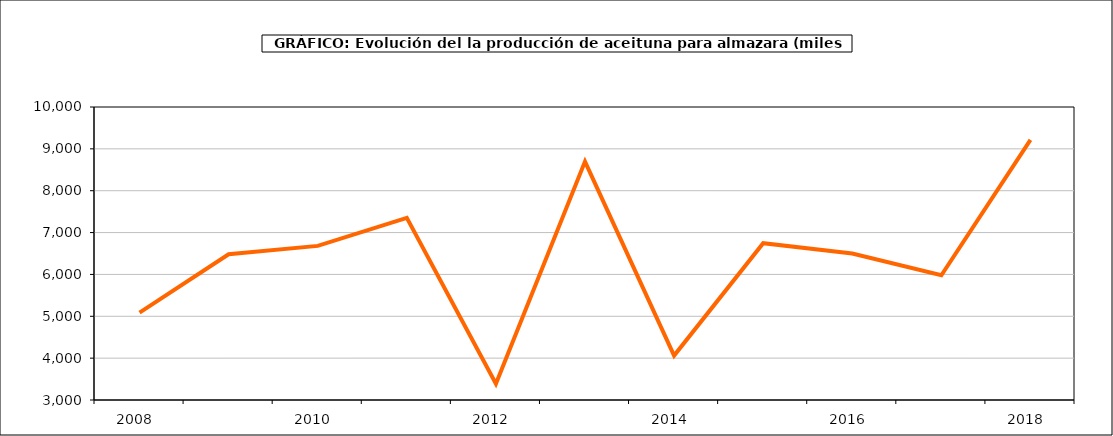
| Category | producción |
|---|---|
| 2008.0 | 5088.942 |
| 2009.0 | 6482.726 |
| 2010.0 | 6682.009 |
| 2011.0 | 7352.697 |
| 2012.0 | 3387.3 |
| 2013.0 | 8695.861 |
| 2014.0 | 4060.978 |
| 2015.0 | 6745.306 |
| 2016.0 | 6499.902 |
| 2017.0 | 5979.204 |
| 2018.0 | 9215.463 |